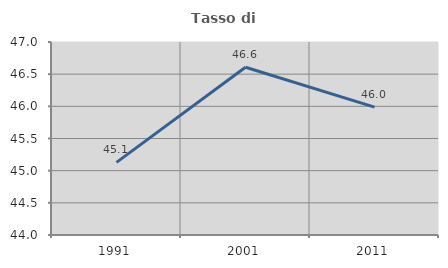
| Category | Tasso di occupazione   |
|---|---|
| 1991.0 | 45.129 |
| 2001.0 | 46.608 |
| 2011.0 | 45.988 |